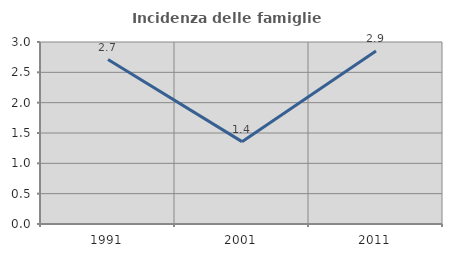
| Category | Incidenza delle famiglie numerose |
|---|---|
| 1991.0 | 2.71 |
| 2001.0 | 1.357 |
| 2011.0 | 2.853 |